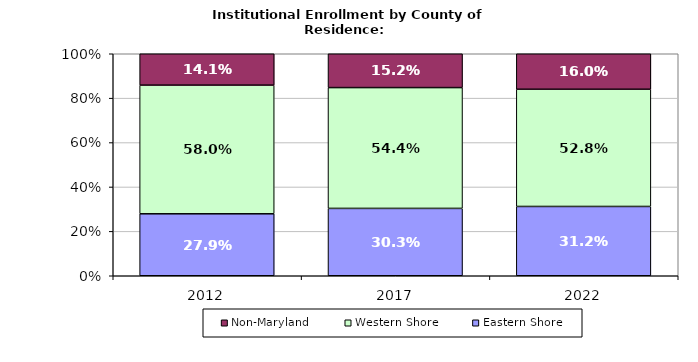
| Category | Eastern Shore | Western Shore | Non-Maryland |
|---|---|---|---|
| 2012.0 | 0.279 | 0.58 | 0.141 |
| 2017.0 | 0.303 | 0.544 | 0.152 |
| 2022.0 | 0.312 | 0.528 | 0.16 |